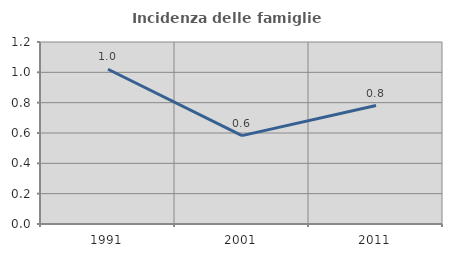
| Category | Incidenza delle famiglie numerose |
|---|---|
| 1991.0 | 1.02 |
| 2001.0 | 0.583 |
| 2011.0 | 0.781 |